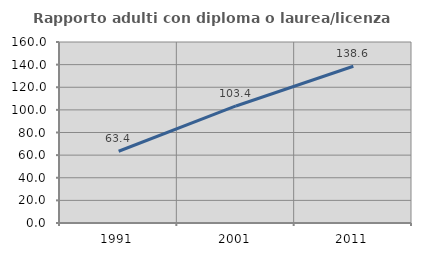
| Category | Rapporto adulti con diploma o laurea/licenza media  |
|---|---|
| 1991.0 | 63.415 |
| 2001.0 | 103.448 |
| 2011.0 | 138.591 |